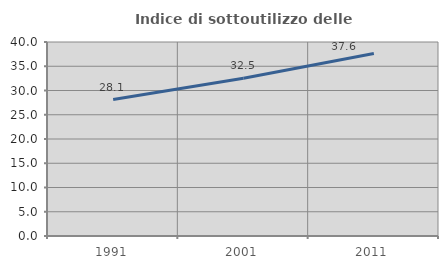
| Category | Indice di sottoutilizzo delle abitazioni  |
|---|---|
| 1991.0 | 28.129 |
| 2001.0 | 32.544 |
| 2011.0 | 37.629 |